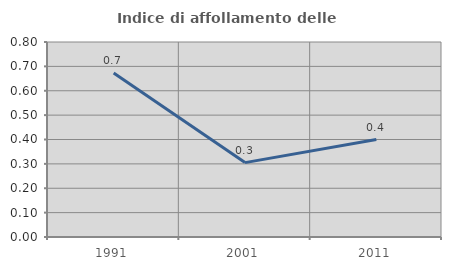
| Category | Indice di affollamento delle abitazioni  |
|---|---|
| 1991.0 | 0.673 |
| 2001.0 | 0.305 |
| 2011.0 | 0.4 |